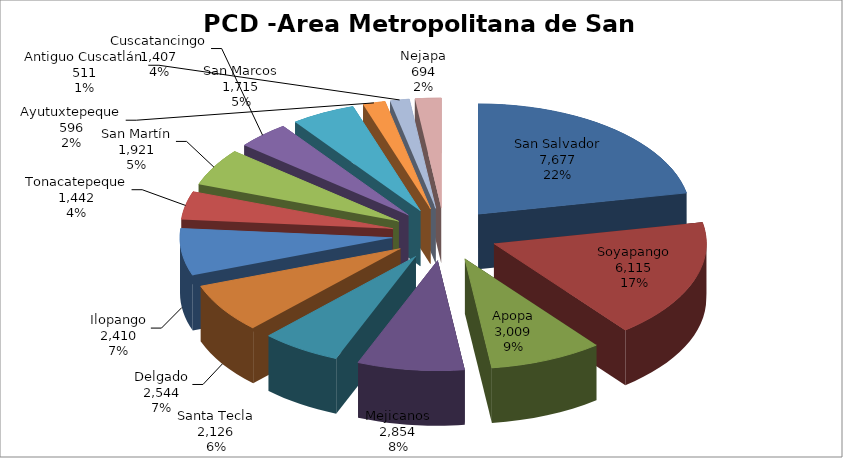
| Category | Series 0 |
|---|---|
| San Salvador | 7677 |
| Soyapango | 6115 |
| Apopa | 3009 |
| Mejicanos | 2854 |
| Santa Tecla | 2126 |
| Delgado | 2544 |
| Ilopango | 2410 |
| Tonacatepeque | 1442 |
| San Martín | 1921 |
| Cuscatancingo | 1407 |
| San Marcos | 1715 |
| Ayutuxtepeque | 596 |
| Antiguo Cuscatlán | 511 |
| Nejapa | 694 |